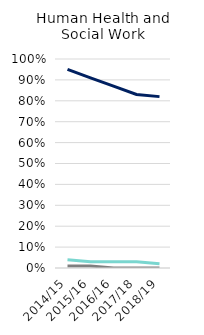
| Category | Employed | Self-Employed | Both |
|---|---|---|---|
| 2014/15 | 0.95 | 0.04 | 0.01 |
| 2015/16 | 0.91 | 0.03 | 0.01 |
| 2016/16 | 0.87 | 0.03 | 0 |
| 2017/18 | 0.83 | 0.03 | 0 |
| 2018/19 | 0.82 | 0.02 | 0 |